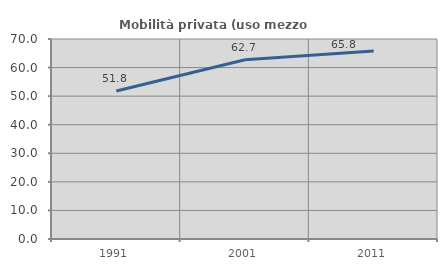
| Category | Mobilità privata (uso mezzo privato) |
|---|---|
| 1991.0 | 51.794 |
| 2001.0 | 62.719 |
| 2011.0 | 65.789 |